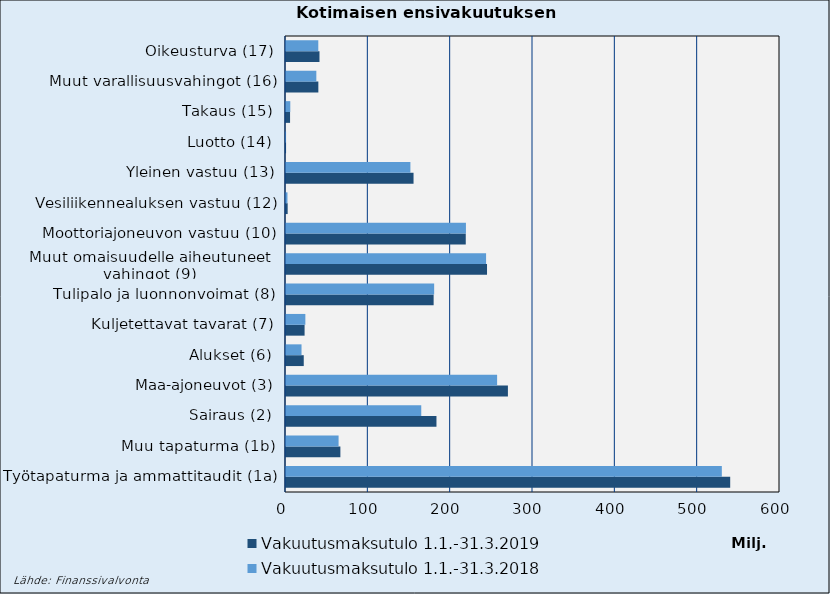
| Category | Vakuutusmaksutulo |
|---|---|
| Työtapaturma ja ammattitaudit (1a) | 529351.97 |
| Muu tapaturma (1b) | 63873.597 |
| Sairaus (2) | 164281.486 |
| Maa-ajoneuvot (3) | 256416.491 |
| Alukset (6) | 18856.443 |
| Kuljetettavat tavarat (7) | 23513.692 |
| Tulipalo ja luonnonvoimat (8) | 179946.903 |
| Muut omaisuudelle aiheutuneet 
vahingot (9) | 243022.5 |
| Moottoriajoneuvon vastuu (10) | 218547.141 |
| Vesiliikennealuksen vastuu (12) | 1778.564 |
| Yleinen vastuu (13) | 151094.226 |
| Luotto (14) | 67.372 |
| Takaus (15) | 5215.313 |
| Muut varallisuusvahingot (16) | 36846.547 |
| Oikeusturva (17) | 39228.599 |